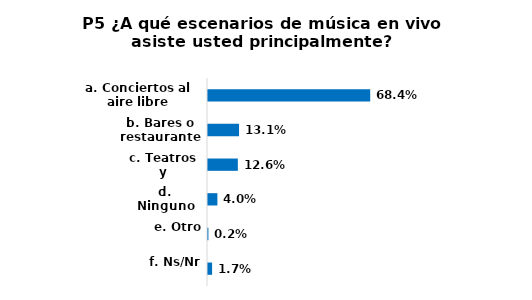
| Category | Series 0 |
|---|---|
| a. Conciertos al aire libre | 0.684 |
| b. Bares o restaurantes | 0.131 |
| c. Teatros y auditorios | 0.126 |
| d. Ninguno | 0.04 |
| e. Otro | 0.002 |
| f. Ns/Nr | 0.017 |